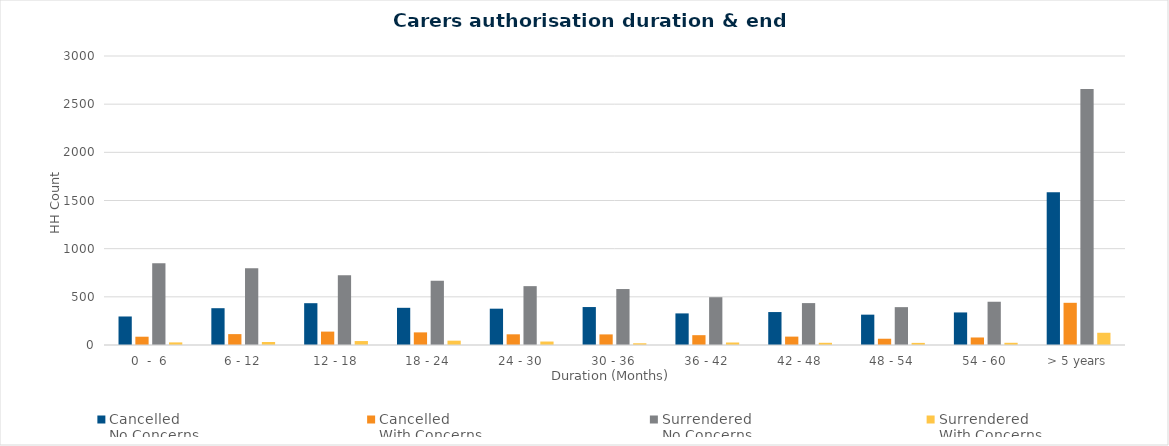
| Category | Cancelled
No Concerns | Cancelled
With Concerns | Surrendered
No Concerns | Surrendered
With Concerns |
|---|---|---|---|---|
| 0  -  6 | 296 | 86 | 848 | 27 |
| 6 - 12 | 382 | 113 | 798 | 31 |
| 12 - 18 | 434 | 139 | 724 | 41 |
| 18 - 24 | 386 | 131 | 667 | 45 |
| 24 - 30 | 377 | 111 | 611 | 36 |
| 30 - 36 | 394 | 110 | 581 | 18 |
| 36 - 42 | 328 | 102 | 496 | 26 |
| 42 - 48 | 342 | 87 | 435 | 23 |
| 48 - 54 | 315 | 65 | 393 | 22 |
| 54 - 60 | 338 | 78 | 449 | 23 |
| > 5 years | 1585 | 438 | 2657 | 127 |